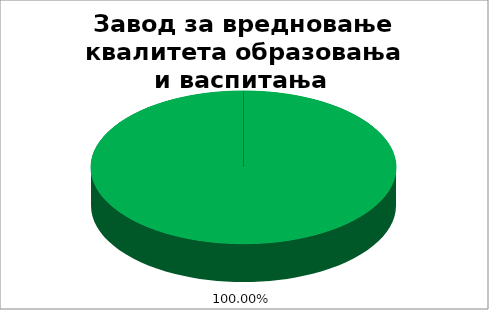
| Category | Завод за вредновање квалитета образовања и васпитања  |
|---|---|
| 0 | 1 |
| 1 | 0 |
| 2 | 0 |
| 3 | 0 |
| 4 | 0 |